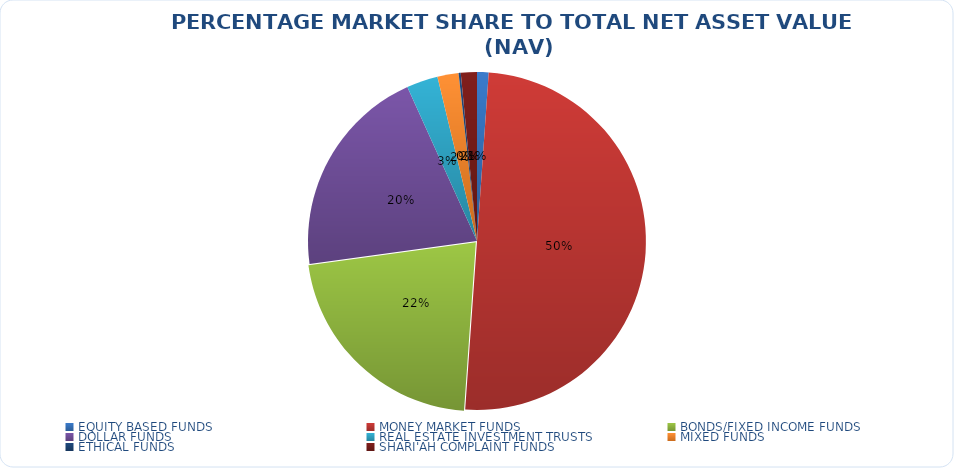
| Category | NET ASSET VALUE |
|---|---|
| EQUITY BASED FUNDS | 17138775616.9 |
| MONEY MARKET FUNDS | 773728453122.663 |
| BONDS/FIXED INCOME FUNDS | 335945984770.622 |
| DOLLAR FUNDS | 315837517726.251 |
| REAL ESTATE INVESTMENT TRUSTS | 46378152063.18 |
| MIXED FUNDS | 31292470255.431 |
| ETHICAL FUNDS | 3158407721.22 |
| SHARI'AH COMPLAINT FUNDS | 23767011958.82 |